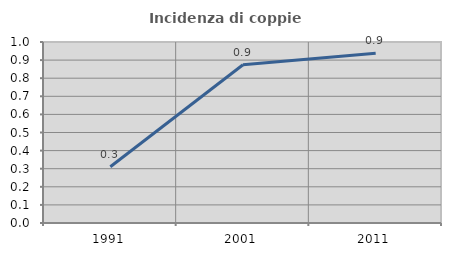
| Category | Incidenza di coppie miste |
|---|---|
| 1991.0 | 0.311 |
| 2001.0 | 0.875 |
| 2011.0 | 0.938 |